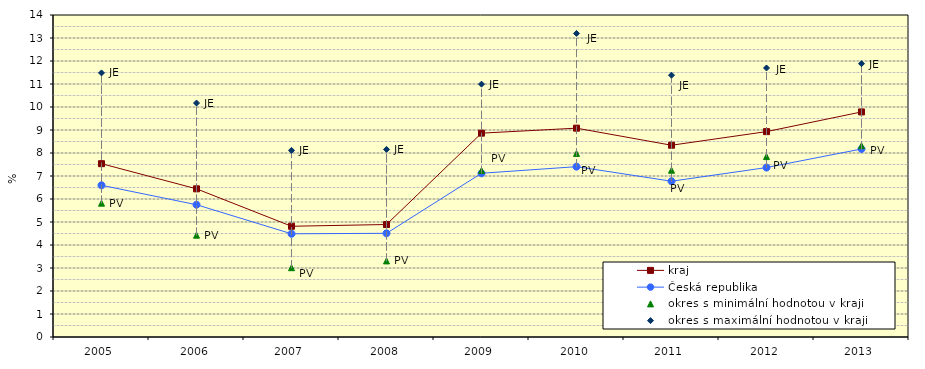
| Category | kraj | Česká republika | okres s minimální hodnotou v kraji | okres s maximální hodnotou v kraji |
|---|---|---|---|---|
| 2005.0 | 7.536 | 6.596 | 5.82 | 11.482 |
| 2006.0 | 6.442 | 5.751 | 4.429 | 10.173 |
| 2007.0 | 4.815 | 4.488 | 3.013 | 8.113 |
| 2008.0 | 4.891 | 4.508 | 3.308 | 8.156 |
| 2009.0 | 8.863 | 7.118 | 7.238 | 10.993 |
| 2010.0 | 9.08 | 7.406 | 7.983 | 13.199 |
| 2011.0 | 8.338 | 6.774 | 7.252 | 11.383 |
| 2012.0 | 8.93 | 7.367 | 7.844 | 11.696 |
| 2013.0 | 9.786 | 8.175 | 8.318 | 11.884 |